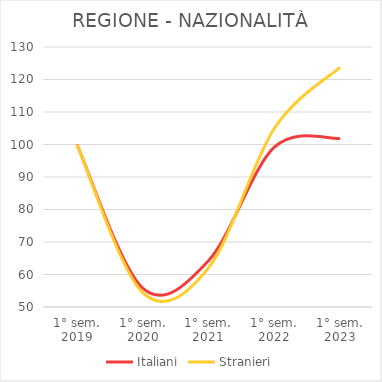
| Category | Italiani | Stranieri |
|---|---|---|
| 1° sem.
2019 | 100 | 100 |
| 1° sem.
2020 | 55.826 | 54.405 |
| 1° sem.
2021 | 64.245 | 62.041 |
| 1° sem.
2022 | 99.165 | 104.928 |
| 1° sem.
2023 | 101.868 | 123.773 |